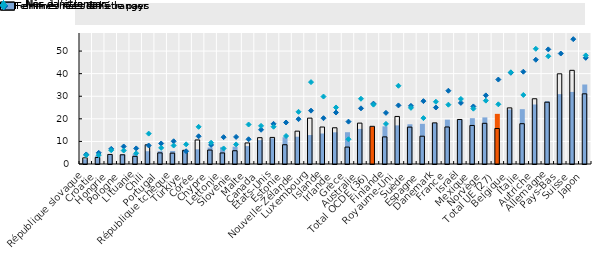
| Category | Nés à l’étranger | Nés dans le pays |
|---|---|---|
| République slovaque | 2.108 | 2.721 |
| Croatie | 3.712 | 2.882 |
| Hongrie | 4.105 | 4.227 |
| Pologne | 4.3 | 4.076 |
| Lituanie | 4.489 | 3.389 |
| Chili | 5.66 | 8.51 |
| Portugal | 5.667 | 4.923 |
| République tchèque | 5.757 | 4.804 |
| Türkiye | 6.199 | 6.071 |
| Corée | 6.513 | 10.649 |
| Chypre | 7.286 | 6.17 |
| Lettonie | 7.453 | 4.889 |
| Slovénie | 7.661 | 5.873 |
| Malte | 7.921 | 9.33 |
| Canada | 10.591 | 11.658 |
| États-Unis | 11.36 | 11.77 |
| Estonie | 11.849 | 8.532 |
| Nouvelle-Zélande | 12.073 | 14.545 |
| Luxembourg | 12.817 | 20.309 |
| Islande | 13.503 | 16.37 |
| Irlande | 14.026 | 16.039 |
| Grèce | 14.075 | 7.492 |
| Australie | 15.534 | 18.102 |
| Total OCDE (36) | 16.483 | 16.686 |
| Finlande | 16.669 | 11.997 |
| Royaume-Uni | 17.096 | 21.052 |
| Suède | 17.597 | 16.329 |
| Espagne | 17.789 | 12.306 |
| Danemark | 18.178 | 18.216 |
| France | 19.624 | 16.39 |
| Israël | 19.81 | 19.71 |
| Mexique | 20.28 | 17.06 |
| Norvège | 20.633 | 18.018 |
| Total UE (27) | 22.201 | 15.724 |
| Belgique | 24.119 | 24.844 |
| Italie | 24.285 | 17.845 |
| Autriche | 26.356 | 28.884 |
| Allemagne | 27.805 | 27.363 |
| Pays-Bas | 30.941 | 39.933 |
| Suisse | 31.906 | 41.474 |
| Japon | 35.199 | 31.068 |